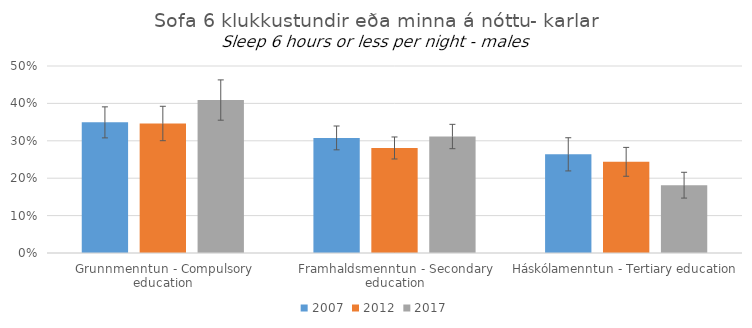
| Category | 2007 | 2012 | 2017 |
|---|---|---|---|
| Grunnmenntun - Compulsory education | 0.349 | 0.346 | 0.409 |
| Framhaldsmenntun - Secondary education | 0.308 | 0.281 | 0.311 |
| Háskólamenntun - Tertiary education | 0.264 | 0.244 | 0.181 |